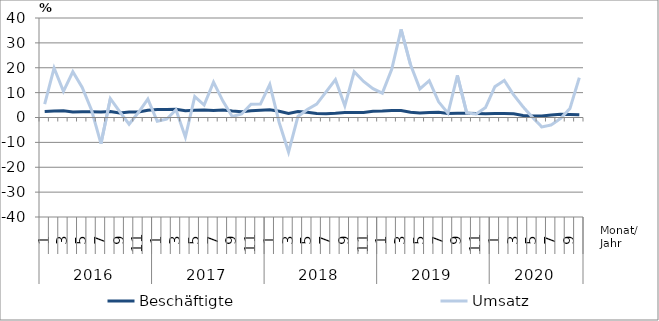
| Category | Beschäftigte | Umsatz |
|---|---|---|
| 0 | 2.4 | 5.4 |
| 1 | 2.6 | 19.9 |
| 2 | 2.7 | 10.5 |
| 3 | 2.2 | 18.4 |
| 4 | 2.3 | 12.1 |
| 5 | 2.3 | 2.9 |
| 6 | 2.2 | -10.5 |
| 7 | 2.4 | 7.6 |
| 8 | 1.8 | 2.4 |
| 9 | 2.2 | -2.7 |
| 10 | 2.2 | 2.1 |
| 11 | 2.9 | 7.4 |
| 12 | 3.2 | -1.5 |
| 13 | 3.2 | -0.7 |
| 14 | 3.3 | 3.1 |
| 15 | 2.7 | -7.9 |
| 16 | 2.9 | 8.4 |
| 17 | 3 | 5 |
| 18 | 2.8 | 14.2 |
| 19 | 3 | 6.6 |
| 20 | 2.6 | 0.4 |
| 21 | 2.3 | 1.4 |
| 22 | 2.7 | 5.3 |
| 23 | 2.9 | 5.4 |
| 24 | 3.1 | 13.3 |
| 25 | 2.5 | -2 |
| 26 | 1.6 | -13.9 |
| 27 | 2.4 | 0.4 |
| 28 | 2.1 | 3.2 |
| 29 | 1.6 | 5.4 |
| 30 | 1.5 | 10.3 |
| 31 | 1.7 | 15.2 |
| 32 | 2 | 4.7 |
| 33 | 2 | 18.4 |
| 34 | 2 | 14.5 |
| 35 | 2.5 | 11.6 |
| 36 | 2.6 | 9.8 |
| 37 | 2.8 | 19.4 |
| 38 | 2.8 | 35.4 |
| 39 | 2.1 | 21.3 |
| 40 | 1.8 | 11.5 |
| 41 | 2 | 14.8 |
| 42 | 2.1 | 6.3 |
| 43 | 1.6 | 1.7 |
| 44 | 1.7 | 16.9 |
| 45 | 1.7 | 1.8 |
| 46 | 1.6 | 1.4 |
| 47 | 1.5 | 4 |
| 48 | 1.6 | 12.4 |
| 49 | 1.6 | 14.9 |
| 50 | 1.5 | 9.1 |
| 51 | 0.8 | 4.3 |
| 52 | 0.6 | 0.1 |
| 53 | 0.6 | -3.8 |
| 54 | 1 | -3 |
| 55 | 1.3 | -0.4 |
| 56 | 1.2 | 3.6 |
| 57 | 1.1 | 16 |